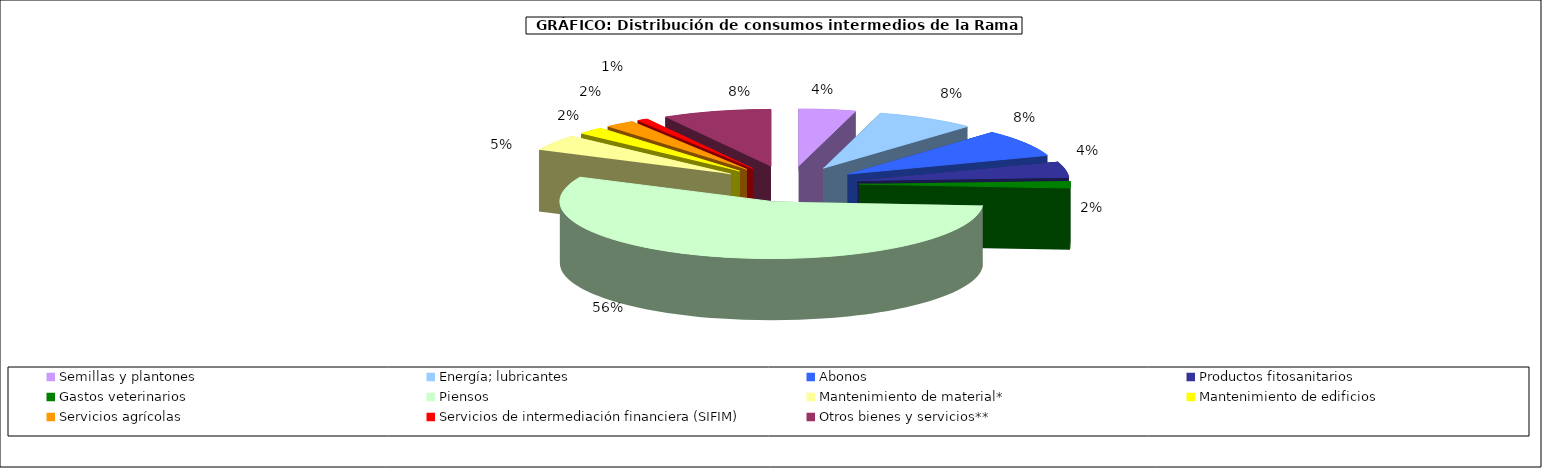
| Category | Consumos Intermedios |
|---|---|
| Semillas y plantones  | 4.346 |
| Energía; lubricantes | 7.58 |
| Abonos | 7.733 |
| Productos fitosanitarios | 4.46 |
| Gastos veterinarios | 1.985 |
| Piensos | 55.884 |
| Mantenimiento de material* | 4.511 |
| Mantenimiento de edificios | 2.071 |
| Servicios agrícolas | 2.289 |
| Servicios de intermediación financiera (SIFIM) | 0.82 |
| Otros bienes y servicios** | 8.321 |